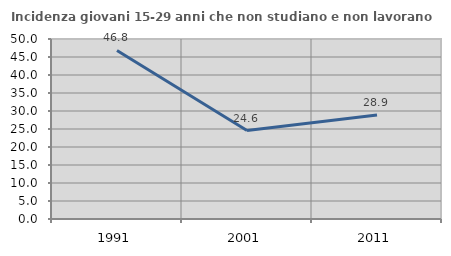
| Category | Incidenza giovani 15-29 anni che non studiano e non lavorano  |
|---|---|
| 1991.0 | 46.816 |
| 2001.0 | 24.576 |
| 2011.0 | 28.866 |